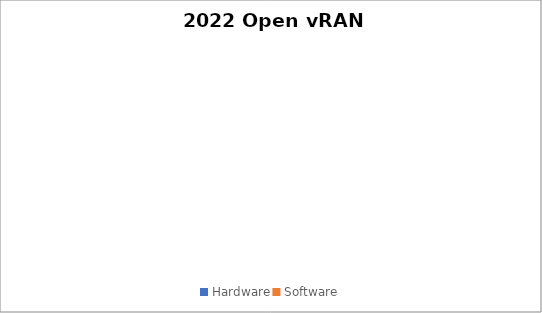
| Category | Series 0 |
|---|---|
| Hardware | 0 |
| Software | 0 |